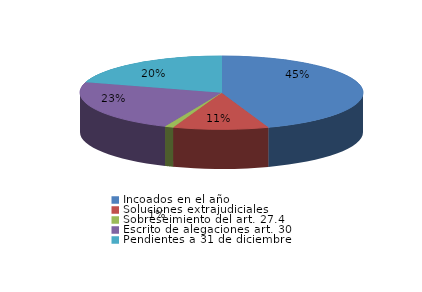
| Category | Series 0 |
|---|---|
| Incoados en el año | 271 |
| Soluciones extrajudiciales | 66 |
| Sobreseimiento del art. 27.4 | 6 |
| Escrito de alegaciones art. 30 | 140 |
| Pendientes a 31 de diciembre | 124 |